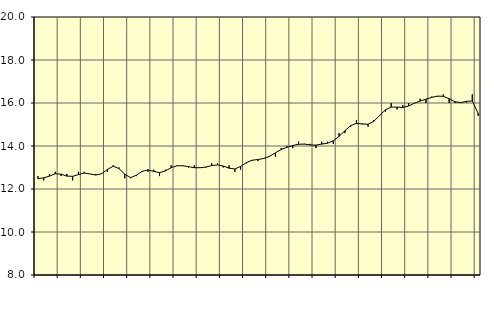
| Category | Piggar | Utbildning, SNI 85 |
|---|---|---|
| nan | 12.6 | 12.48 |
| 1.0 | 12.4 | 12.52 |
| 1.0 | 12.7 | 12.6 |
| 1.0 | 12.8 | 12.71 |
| nan | 12.6 | 12.69 |
| 2.0 | 12.7 | 12.6 |
| 2.0 | 12.4 | 12.59 |
| 2.0 | 12.8 | 12.67 |
| nan | 12.8 | 12.74 |
| 3.0 | 12.7 | 12.7 |
| 3.0 | 12.7 | 12.65 |
| 3.0 | 12.7 | 12.71 |
| nan | 12.8 | 12.91 |
| 4.0 | 13.1 | 13.06 |
| 4.0 | 13 | 12.95 |
| 4.0 | 12.5 | 12.69 |
| nan | 12.5 | 12.53 |
| 5.0 | 12.6 | 12.64 |
| 5.0 | 12.8 | 12.82 |
| 5.0 | 12.8 | 12.89 |
| nan | 12.9 | 12.82 |
| 6.0 | 12.6 | 12.76 |
| 6.0 | 12.9 | 12.84 |
| 6.0 | 13.1 | 12.99 |
| nan | 13.1 | 13.08 |
| 7.0 | 13.1 | 13.08 |
| 7.0 | 13 | 13.04 |
| 7.0 | 13.1 | 12.99 |
| nan | 13 | 12.99 |
| 8.0 | 13 | 13.02 |
| 8.0 | 13.2 | 13.09 |
| 8.0 | 13.2 | 13.12 |
| nan | 13 | 13.07 |
| 9.0 | 13.1 | 12.97 |
| 9.0 | 12.8 | 12.93 |
| 9.0 | 12.9 | 13.05 |
| nan | 13.2 | 13.23 |
| 10.0 | 13.3 | 13.34 |
| 10.0 | 13.3 | 13.37 |
| 10.0 | 13.4 | 13.42 |
| nan | 13.5 | 13.52 |
| 11.0 | 13.5 | 13.68 |
| 11.0 | 13.9 | 13.84 |
| 11.0 | 14 | 13.94 |
| nan | 13.9 | 14.02 |
| 12.0 | 14.2 | 14.08 |
| 12.0 | 14.1 | 14.09 |
| 12.0 | 14.1 | 14.05 |
| nan | 13.9 | 14.04 |
| 13.0 | 14.2 | 14.09 |
| 13.0 | 14.2 | 14.13 |
| 13.0 | 14.1 | 14.24 |
| nan | 14.6 | 14.45 |
| 14.0 | 14.6 | 14.71 |
| 14.0 | 14.9 | 14.95 |
| 14.0 | 15.2 | 15.05 |
| nan | 15 | 15.03 |
| 15.0 | 14.9 | 15.01 |
| 15.0 | 15.2 | 15.15 |
| 15.0 | 15.4 | 15.42 |
| nan | 15.6 | 15.68 |
| 16.0 | 16 | 15.81 |
| 16.0 | 15.7 | 15.81 |
| 16.0 | 15.9 | 15.79 |
| nan | 16 | 15.86 |
| 17.0 | 16 | 15.99 |
| 17.0 | 16.2 | 16.09 |
| 17.0 | 16 | 16.18 |
| nan | 16.3 | 16.26 |
| 18.0 | 16.3 | 16.32 |
| 18.0 | 16.4 | 16.31 |
| 18.0 | 16 | 16.2 |
| nan | 16 | 16.06 |
| 19.0 | 16 | 16.02 |
| 19.0 | 16 | 16.08 |
| 19.0 | 16.4 | 16.09 |
| nan | 15.4 | 15.53 |